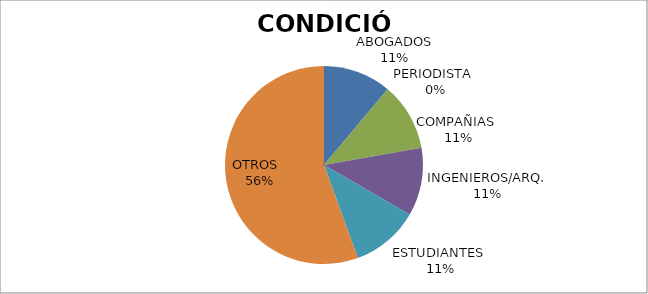
| Category | Series 0 |
|---|---|
| ABOGADOS | 1 |
| PERIODISTA  | 0 |
| COMPAÑIAS  | 1 |
| INGENIEROS/ARQ. | 1 |
| ESTUDIANTES  | 1 |
| OTROS   | 5 |